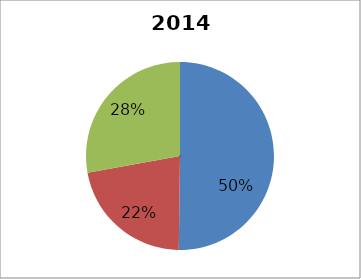
| Category | 2013 Breakdown |
|---|---|
| 0 | 0.502 |
| 1 | 0.22 |
| 2 | 0.278 |